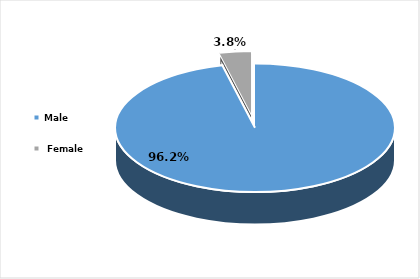
| Category | Series 0 |
|---|---|
| Male | 531824 |
|  Female | 20732 |